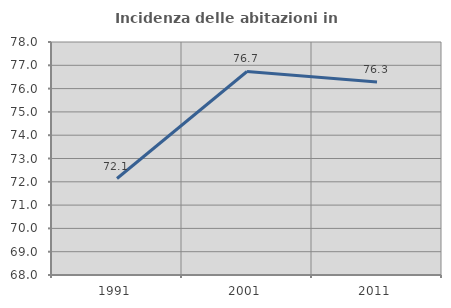
| Category | Incidenza delle abitazioni in proprietà  |
|---|---|
| 1991.0 | 72.14 |
| 2001.0 | 76.735 |
| 2011.0 | 76.285 |